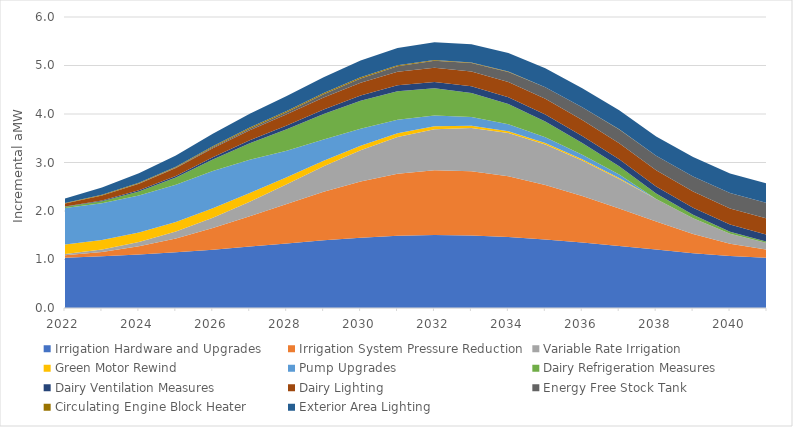
| Category | Irrigation Hardware and Upgrades | Irrigation System Pressure Reduction | Variable Rate Irrigation | Green Motor Rewind | Pump Upgrades | Dairy Refrigeration Measures | Dairy Ventilation Measures | Dairy Lighting | Energy Free Stock Tank | Circulating Engine Block Heater | Exterior Area Lighting |
|---|---|---|---|---|---|---|---|---|---|---|---|
| 2022.0 | 1.036 | 0.051 | 0.024 | 0.196 | 0.755 | 0.026 | 0.006 | 0.06 | 0.001 | 0.01 | 0.09 |
| 2023.0 | 1.067 | 0.09 | 0.049 | 0.197 | 0.758 | 0.041 | 0.014 | 0.103 | 0.003 | 0.012 | 0.153 |
| 2024.0 | 1.105 | 0.17 | 0.086 | 0.197 | 0.76 | 0.084 | 0.023 | 0.135 | 0.006 | 0.015 | 0.196 |
| 2025.0 | 1.147 | 0.288 | 0.14 | 0.199 | 0.766 | 0.15 | 0.034 | 0.161 | 0.011 | 0.018 | 0.23 |
| 2026.0 | 1.203 | 0.444 | 0.212 | 0.199 | 0.764 | 0.239 | 0.046 | 0.186 | 0.019 | 0.02 | 0.26 |
| 2027.0 | 1.266 | 0.625 | 0.302 | 0.179 | 0.686 | 0.341 | 0.06 | 0.208 | 0.03 | 0.024 | 0.286 |
| 2028.0 | 1.33 | 0.816 | 0.407 | 0.143 | 0.548 | 0.443 | 0.076 | 0.229 | 0.045 | 0.026 | 0.308 |
| 2029.0 | 1.395 | 1.004 | 0.525 | 0.114 | 0.438 | 0.526 | 0.092 | 0.247 | 0.064 | 0.026 | 0.326 |
| 2030.0 | 1.447 | 1.162 | 0.645 | 0.092 | 0.352 | 0.577 | 0.107 | 0.264 | 0.087 | 0.025 | 0.342 |
| 2031.0 | 1.49 | 1.28 | 0.758 | 0.073 | 0.281 | 0.588 | 0.121 | 0.279 | 0.114 | 0.021 | 0.356 |
| 2032.0 | 1.506 | 1.337 | 0.845 | 0.059 | 0.225 | 0.558 | 0.131 | 0.293 | 0.144 | 0.017 | 0.367 |
| 2033.0 | 1.493 | 1.328 | 0.892 | 0.047 | 0.18 | 0.496 | 0.138 | 0.304 | 0.175 | 0.011 | 0.375 |
| 2034.0 | 1.462 | 1.256 | 0.89 | 0.038 | 0.144 | 0.416 | 0.142 | 0.315 | 0.206 | 0.007 | 0.382 |
| 2035.0 | 1.41 | 1.128 | 0.835 | 0.03 | 0.116 | 0.327 | 0.144 | 0.324 | 0.237 | 0.003 | 0.387 |
| 2036.0 | 1.349 | 0.958 | 0.736 | 0.024 | 0.093 | 0.241 | 0.145 | 0.327 | 0.263 | 0.001 | 0.391 |
| 2037.0 | 1.28 | 0.77 | 0.61 | 0.02 | 0.075 | 0.169 | 0.145 | 0.33 | 0.285 | 0.001 | 0.394 |
| 2038.0 | 1.205 | 0.577 | 0.467 | 0 | 0.001 | 0.113 | 0.145 | 0.332 | 0.301 | 0 | 0.397 |
| 2039.0 | 1.131 | 0.396 | 0.324 | 0 | 0 | 0.072 | 0.145 | 0.333 | 0.312 | 0 | 0.399 |
| 2040.0 | 1.071 | 0.252 | 0.207 | 0 | 0 | 0.044 | 0.145 | 0.335 | 0.318 | 0 | 0.4 |
| 2041.0 | 1.037 | 0.166 | 0.136 | 0 | 0 | 0.025 | 0.145 | 0.336 | 0.322 | 0 | 0.401 |